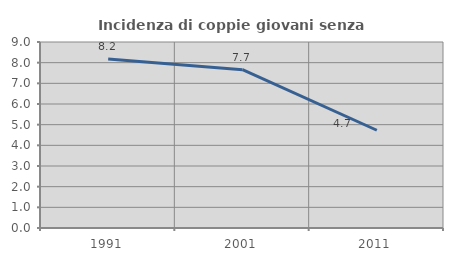
| Category | Incidenza di coppie giovani senza figli |
|---|---|
| 1991.0 | 8.173 |
| 2001.0 | 7.663 |
| 2011.0 | 4.73 |